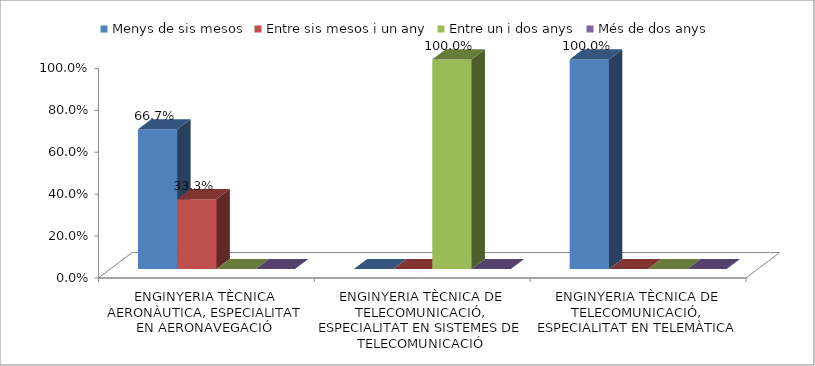
| Category | Menys de sis mesos | Entre sis mesos i un any | Entre un i dos anys | Més de dos anys |
|---|---|---|---|---|
| ENGINYERIA TÈCNICA AERONÀUTICA, ESPECIALITAT EN AERONAVEGACIÓ | 0.667 | 0.333 | 0 | 0 |
| ENGINYERIA TÈCNICA DE TELECOMUNICACIÓ, ESPECIALITAT EN SISTEMES DE TELECOMUNICACIÓ | 0 | 0 | 1 | 0 |
| ENGINYERIA TÈCNICA DE TELECOMUNICACIÓ, ESPECIALITAT EN TELEMÀTICA | 1 | 0 | 0 | 0 |